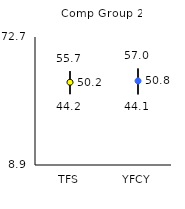
| Category | 25th | 75th | Mean |
|---|---|---|---|
| TFS | 44.2 | 55.7 | 50.15 |
| YFCY | 44.1 | 57 | 50.81 |